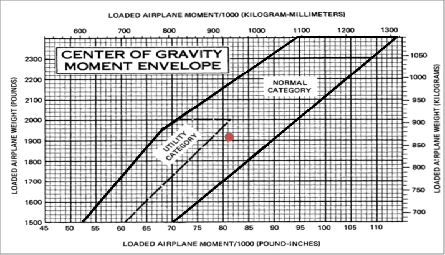
| Category | Series 0 |
|---|---|
| 937.0927317510077 | 868.36 |